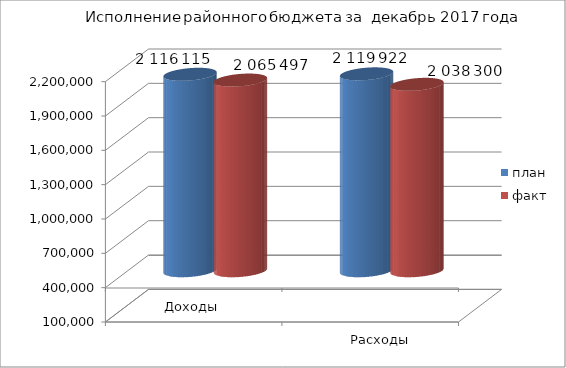
| Category | план | факт |
|---|---|---|
| 0 | 2116115 | 2065497 |
| 1 | 2119922 | 2028300.4 |